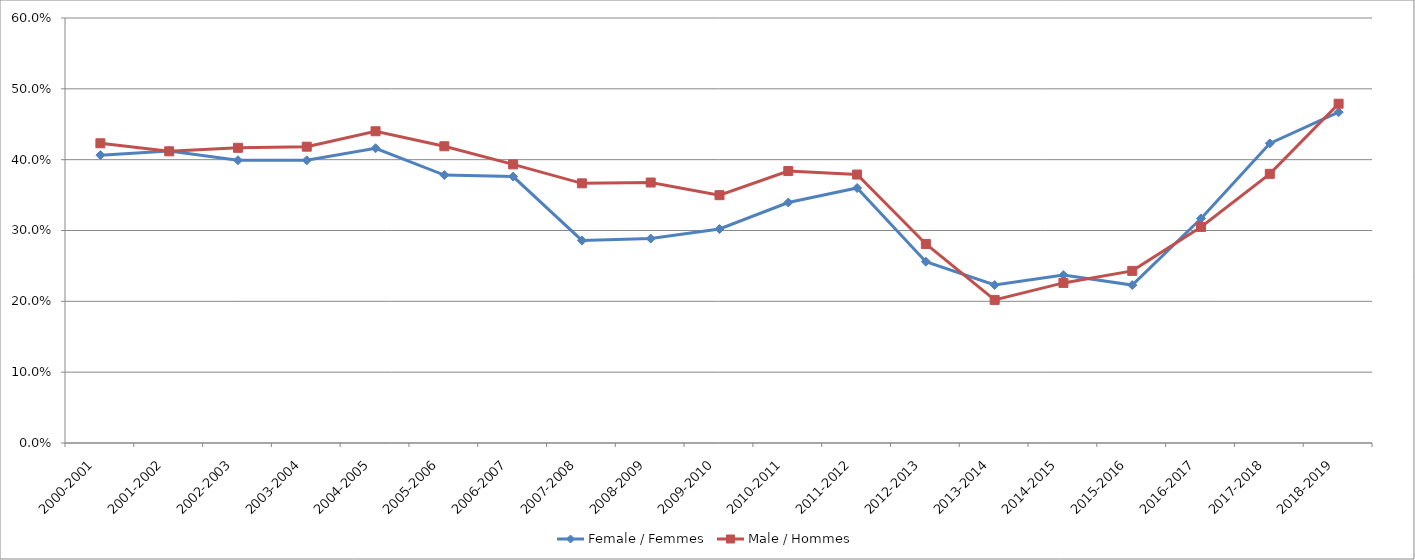
| Category | Female / Femmes | Male / Hommes |
|---|---|---|
| 2000-2001 | 0.406 | 0.423 |
| 2001-2002 | 0.412 | 0.412 |
| 2002-2003 | 0.399 | 0.417 |
| 2003-2004 | 0.399 | 0.418 |
| 2004-2005 | 0.416 | 0.44 |
| 2005-2006 | 0.378 | 0.419 |
| 2006-2007 | 0.376 | 0.393 |
| 2007-2008 | 0.286 | 0.367 |
| 2008-2009 | 0.289 | 0.368 |
| 2009-2010 | 0.302 | 0.35 |
| 2010-2011 | 0.34 | 0.384 |
| 2011-2012 | 0.36 | 0.379 |
| 2012-2013 | 0.256 | 0.281 |
| 2013-2014 | 0.223 | 0.202 |
| 2014-2015 | 0.237 | 0.226 |
| 2015-2016 | 0.223 | 0.243 |
| 2016-2017 | 0.317 | 0.305 |
| 2017-2018 | 0.423 | 0.38 |
| 2018-2019 | 0.467 | 0.479 |